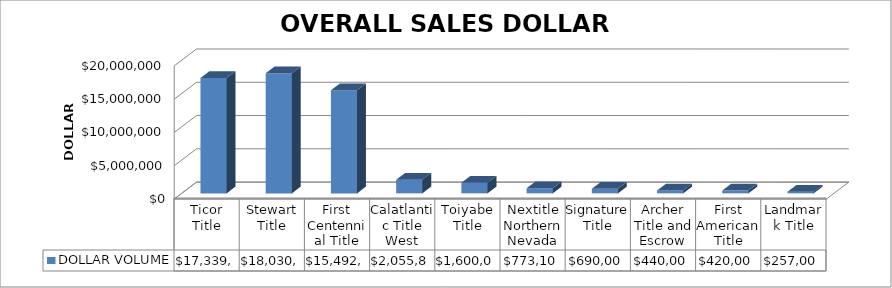
| Category | DOLLAR VOLUME |
|---|---|
| Ticor Title | 17339715 |
| Stewart Title | 18030628 |
| First Centennial Title | 15492780 |
| Calatlantic Title West | 2055829 |
| Toiyabe Title | 1600000 |
| Nextitle Northern Nevada | 773100 |
| Signature Title | 690000 |
| Archer Title and Escrow | 440000 |
| First American Title | 420000 |
| Landmark Title | 257000 |